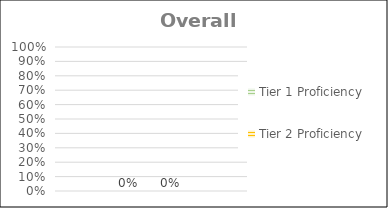
| Category | Tier 1 Proficiency | Tier 2 Proficiency |
|---|---|---|
| 0 | 0 | 0 |